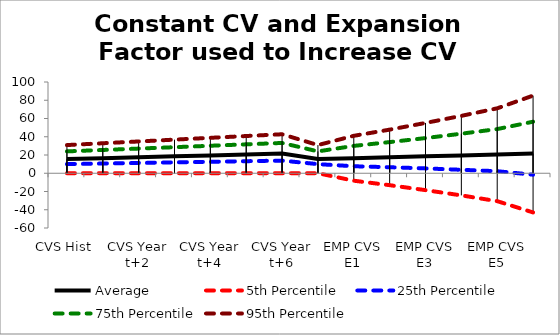
| Category | Average | 5th Percentile | 25th Percentile | 75th Percentile | 95th Percentile |
|---|---|---|---|---|---|
| CVS Hist | 15.561 | 0.012 | 9.998 | 23.965 | 30.883 |
| CVS Year t+1 | 16.56 | 0.069 | 10.641 | 25.514 | 32.873 |
| CVS Year t+2 | 17.562 | 0.059 | 11.29 | 27.037 | 34.833 |
| CVS Year t+3 | 18.562 | 0.026 | 11.94 | 28.556 | 36.845 |
| CVS Year t+4 | 19.561 | 0.085 | 12.549 | 30.128 | 38.823 |
| CVS Year t+5 | 20.561 | 0.104 | 13.227 | 31.702 | 40.798 |
| CVS Year t+6 | 21.561 | 0.06 | 13.847 | 33.202 | 42.734 |
| EMP Hist  | 15.561 | 0.012 | 9.998 | 23.965 | 30.883 |
| EMP CVS E1 | 16.56 | -8.176 | 7.682 | 29.992 | 41.03 |
| EMP CVS E2 | 17.563 | -13.068 | 6.587 | 34.144 | 47.789 |
| EMP CVS E3 | 18.564 | -18.508 | 5.32 | 38.553 | 55.13 |
| EMP CVS E4 | 19.562 | -24.258 | 3.786 | 43.339 | 62.902 |
| EMP CVS E5 | 20.564 | -30.579 | 2.226 | 48.416 | 71.155 |
| EMP CVS E6 | 21.562 | -42.939 | -1.579 | 56.485 | 85.082 |